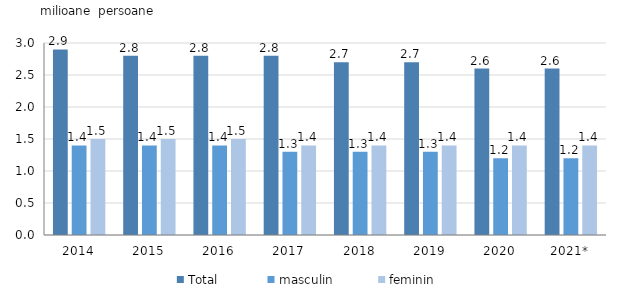
| Category | Total  | masculin | feminin |
|---|---|---|---|
| 2014 | 2.9 | 1.4 | 1.5 |
| 2015 | 2.8 | 1.4 | 1.5 |
| 2016 | 2.8 | 1.4 | 1.5 |
| 2017 | 2.8 | 1.3 | 1.4 |
| 2018 | 2.7 | 1.3 | 1.4 |
| 2019 | 2.7 | 1.3 | 1.4 |
| 2020 | 2.6 | 1.2 | 1.4 |
| 2021* | 2.6 | 1.2 | 1.4 |